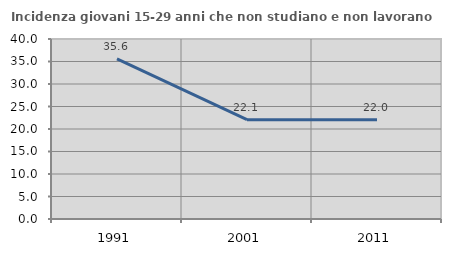
| Category | Incidenza giovani 15-29 anni che non studiano e non lavorano  |
|---|---|
| 1991.0 | 35.567 |
| 2001.0 | 22.075 |
| 2011.0 | 22.042 |